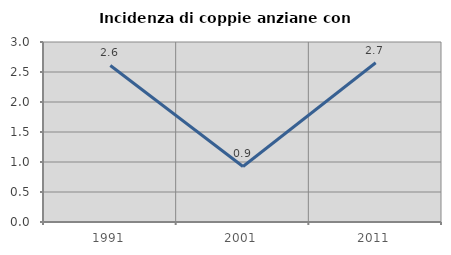
| Category | Incidenza di coppie anziane con figli |
|---|---|
| 1991.0 | 2.609 |
| 2001.0 | 0.926 |
| 2011.0 | 2.655 |